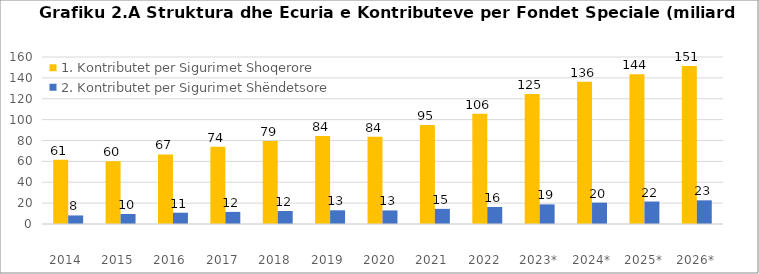
| Category | 1. Kontributet per Sigurimet Shoqerore  | 2. Kontributet per Sigurimet Shëndetsore |
|---|---|---|
| 2014  | 61.493 | 8.199 |
| 2015  | 60.148 | 9.595 |
| 2016  | 66.688 | 10.82 |
| 2017  | 73.999 | 11.602 |
| 2018  | 79.421 | 12.43 |
| 2019  | 84.267 | 13.129 |
| 2020  | 83.5 | 13.02 |
| 2021  | 94.9 | 14.5 |
| 2022  | 105.6 | 16.3 |
| 2023* | 124.6 | 18.8 |
| 2024* | 136.24 | 20.48 |
| 2025* | 143.56 | 21.54 |
| 2026* | 151.44 | 22.68 |